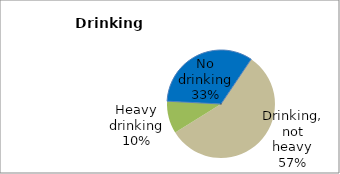
| Category | Series 0 |
|---|---|
| No drinking | 33.608 |
| Drinking, not heavy | 56.677 |
| Heavy drinking | 9.715 |